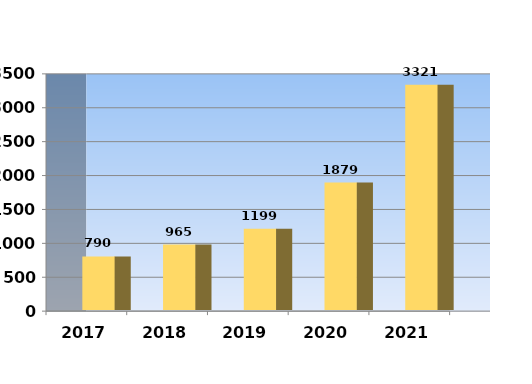
| Category | Series 0 |
|---|---|
| 2017.0 | 790 |
| 2018.0 | 965 |
| 2019.0 | 1199 |
| 2020.0 | 1879 |
| 2021.0 | 3321 |